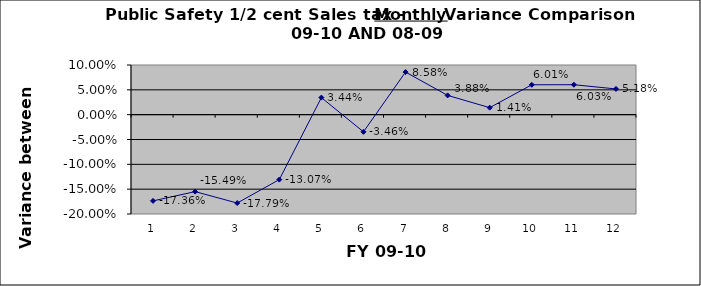
| Category | September October November December January February March April May June  July August |
|---|---|
| 0 | -0.174 |
| 1 | -0.155 |
| 2 | -0.178 |
| 3 | -0.131 |
| 4 | 0.034 |
| 5 | -0.035 |
| 6 | 0.086 |
| 7 | 0.039 |
| 8 | 0.014 |
| 9 | 0.06 |
| 10 | 0.06 |
| 11 | 0.052 |